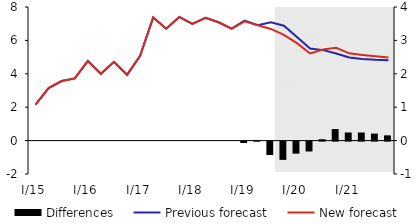
| Category | Differences |
|---|---|
| I/15 | 0 |
| II | 0 |
| III | 0 |
| IV | 0 |
| I/16 | 0 |
| II | 0 |
| III | 0 |
| IV | 0 |
| I/17 | 0 |
| II | 0 |
| III | 0 |
| IV | 0 |
| I/18 | 0 |
| II | 0 |
| III | 0 |
| IV | 0 |
| I/19 | -0.041 |
| II | -0.003 |
| III | -0.401 |
| IV | -0.547 |
| I/20 | -0.362 |
| II | -0.296 |
| III | 0.041 |
| IV | 0.345 |
| I/21 | 0.242 |
| II | 0.242 |
| III | 0.21 |
| IV | 0.157 |